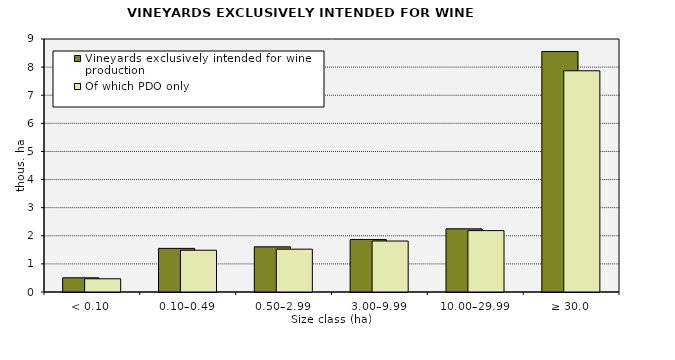
| Category | Vineyards exclusively intended for wine production | Of which PDO only  |
|---|---|---|
| < 0.10 | 504.782 | 469.678 |
| 0.10–0.49 | 1551.356 | 1486.777 |
| 0.50–2.99 | 1606.705 | 1523.956 |
| 3.00–9.99 | 1868.594 | 1813.389 |
| 10.00–29.99 | 2246.877 | 2184.117 |
| ≥ 30.0 | 8555.872 | 7869.925 |